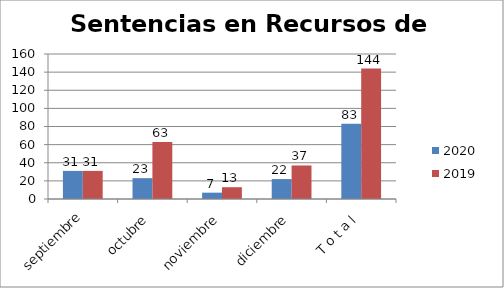
| Category | 2020 | 2019 |
|---|---|---|
| septiembre | 31 | 31 |
| octubre | 23 | 63 |
| noviembre | 7 | 13 |
| diciembre | 22 | 37 |
| T o t a l | 83 | 144 |